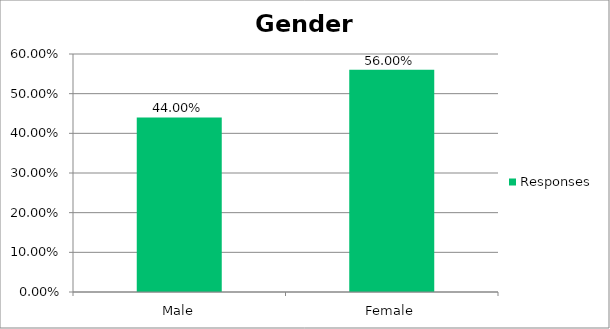
| Category | Responses |
|---|---|
| Male | 0.44 |
| Female | 0.56 |